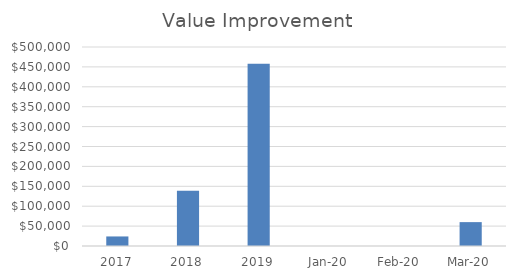
| Category | Total Cost Savings + Cost Avoidance |
|---|---|
| 2017.0 | 24000 |
| 2018.0 | 138912.42 |
| 2019.0 | 457700 |
| 43831.0 | 0 |
| 43862.0 | 0 |
| 43891.0 | 60000 |